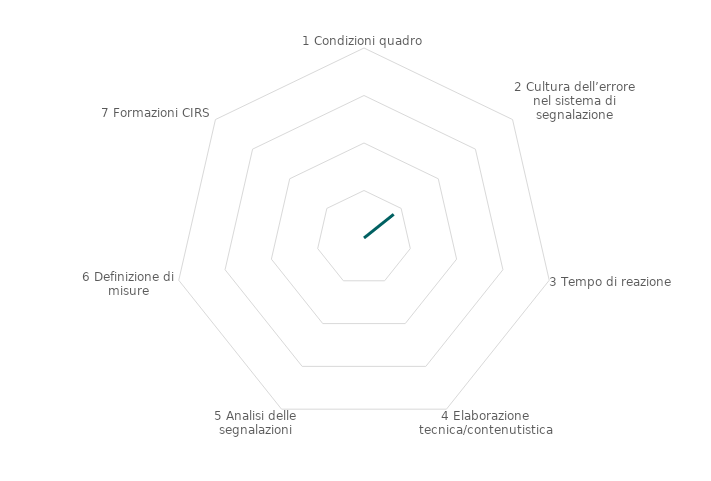
| Category | Series 0 |
|---|---|
| 1 Condizioni quadro | 0 |
| 2 Cultura dell’errore nel sistema di segnalazione | 0.2 |
| 3 Tempo di reazione | 0 |
| 4 Elaborazione tecnica/contenutistica | 0 |
| 5 Analisi delle segnalazioni | 0 |
| 6 Definizione di misure | 0 |
| 7 Formazioni CIRS | 0 |